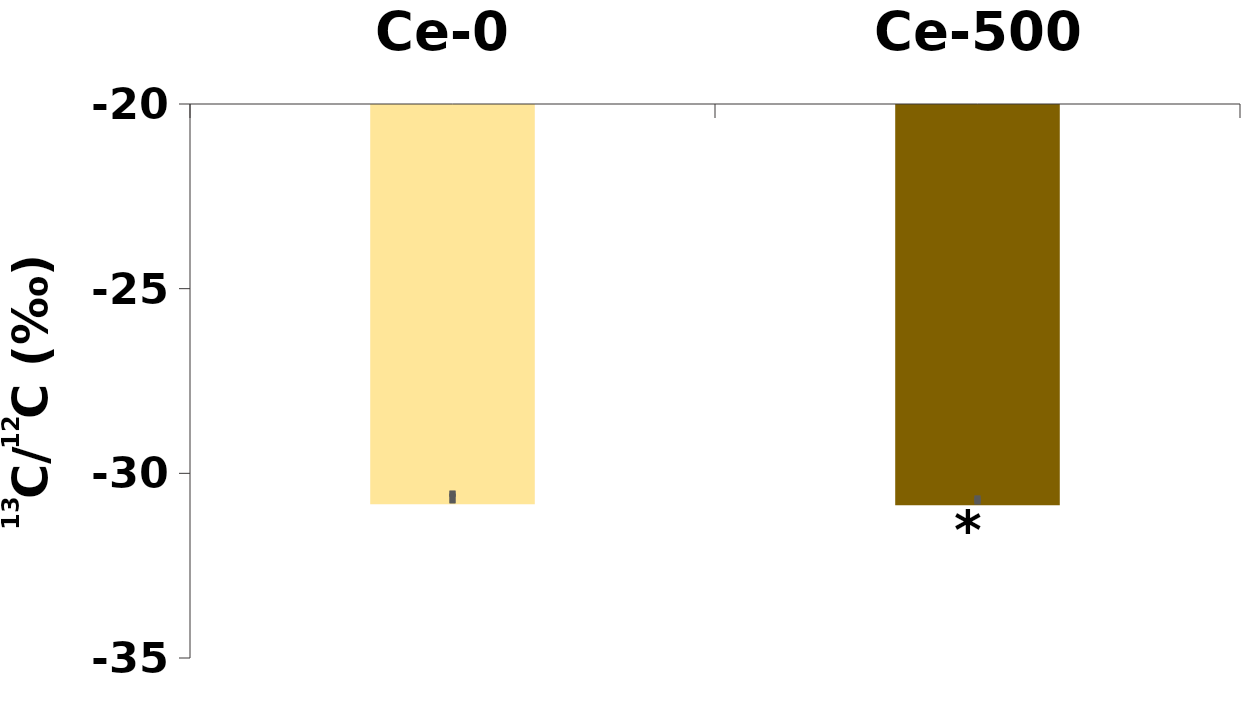
| Category | δ13C |
|---|---|
| Ce-0 | -30.812 |
| Ce-500 | -30.84 |